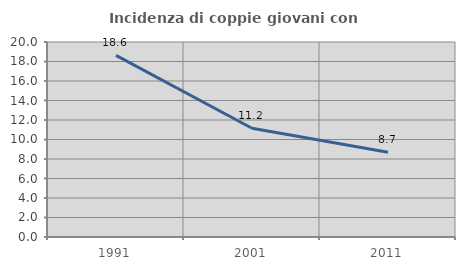
| Category | Incidenza di coppie giovani con figli |
|---|---|
| 1991.0 | 18.631 |
| 2001.0 | 11.152 |
| 2011.0 | 8.696 |